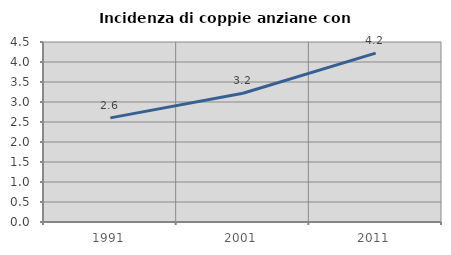
| Category | Incidenza di coppie anziane con figli |
|---|---|
| 1991.0 | 2.603 |
| 2001.0 | 3.218 |
| 2011.0 | 4.223 |